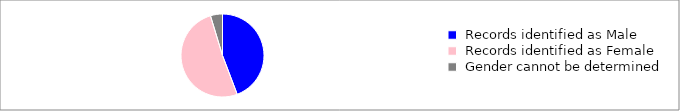
| Category | Series 0 |
|---|---|
|  Records identified as Male  | 33756 |
|  Records identified as Female  | 38993 |
|  Gender cannot be determined  | 3571 |